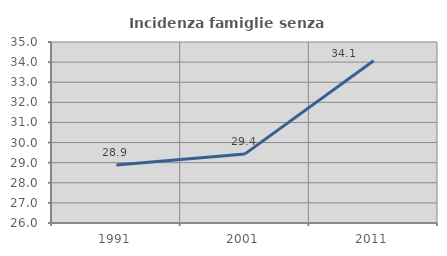
| Category | Incidenza famiglie senza nuclei |
|---|---|
| 1991.0 | 28.883 |
| 2001.0 | 29.436 |
| 2011.0 | 34.068 |